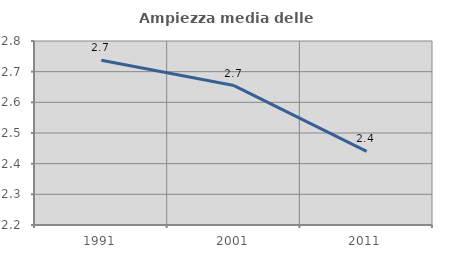
| Category | Ampiezza media delle famiglie |
|---|---|
| 1991.0 | 2.737 |
| 2001.0 | 2.655 |
| 2011.0 | 2.44 |